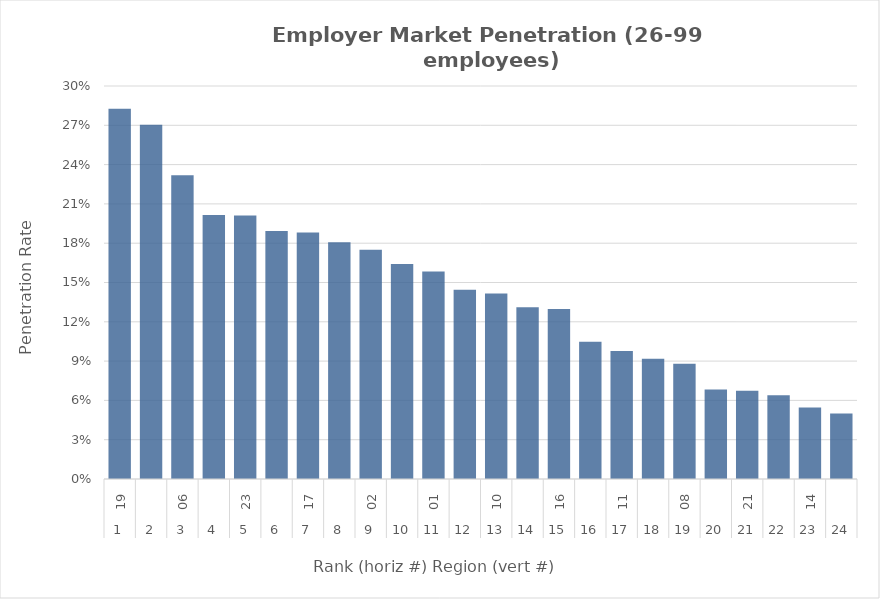
| Category | Rate |
|---|---|
| 0 | 0.283 |
| 1 | 0.27 |
| 2 | 0.232 |
| 3 | 0.202 |
| 4 | 0.201 |
| 5 | 0.189 |
| 6 | 0.188 |
| 7 | 0.181 |
| 8 | 0.175 |
| 9 | 0.164 |
| 10 | 0.158 |
| 11 | 0.144 |
| 12 | 0.142 |
| 13 | 0.131 |
| 14 | 0.13 |
| 15 | 0.105 |
| 16 | 0.098 |
| 17 | 0.092 |
| 18 | 0.088 |
| 19 | 0.068 |
| 20 | 0.067 |
| 21 | 0.064 |
| 22 | 0.055 |
| 23 | 0.05 |